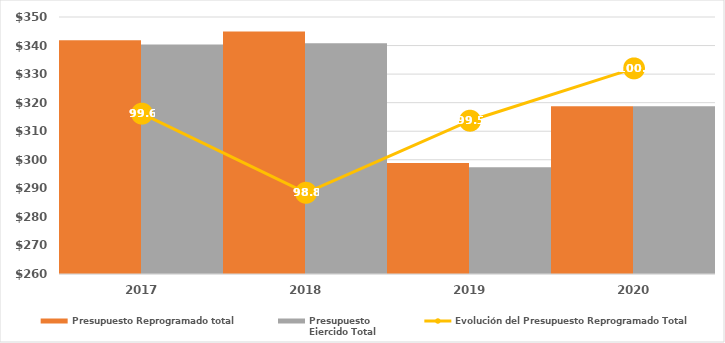
| Category | Presupuesto Reprogramado total | Presupuesto
Ejercido Total |
|---|---|---|
| 2017.0 | 341839.2 | 340334.7 |
| 2018.0 | 344938.7 | 340765 |
| 2019.0 | 298904.428 | 297383.7 |
| 2020.0 | 318785.247 | 318785.247 |